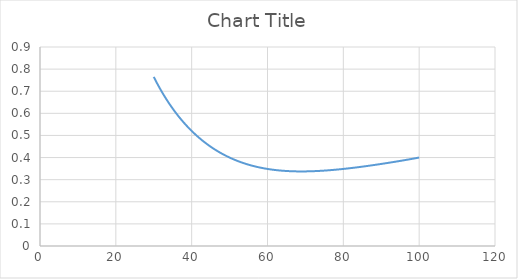
| Category | Series 0 |
|---|---|
| 30.0 | 0.765 |
| 31.0 | 0.732 |
| 32.0 | 0.701 |
| 33.0 | 0.673 |
| 34.0 | 0.646 |
| 35.0 | 0.621 |
| 36.0 | 0.598 |
| 37.0 | 0.577 |
| 38.0 | 0.557 |
| 39.0 | 0.538 |
| 40.0 | 0.52 |
| 41.0 | 0.504 |
| 42.0 | 0.489 |
| 43.0 | 0.475 |
| 44.0 | 0.461 |
| 45.0 | 0.449 |
| 46.0 | 0.438 |
| 47.0 | 0.427 |
| 48.0 | 0.417 |
| 49.0 | 0.408 |
| 50.0 | 0.4 |
| 51.0 | 0.392 |
| 52.0 | 0.385 |
| 53.0 | 0.379 |
| 54.0 | 0.373 |
| 55.0 | 0.368 |
| 56.0 | 0.363 |
| 57.0 | 0.359 |
| 58.0 | 0.355 |
| 59.0 | 0.351 |
| 60.0 | 0.348 |
| 61.0 | 0.346 |
| 62.0 | 0.344 |
| 63.0 | 0.342 |
| 64.0 | 0.34 |
| 65.0 | 0.339 |
| 66.0 | 0.338 |
| 67.0 | 0.338 |
| 68.0 | 0.337 |
| 69.0 | 0.337 |
| 70.0 | 0.337 |
| 71.0 | 0.338 |
| 72.0 | 0.338 |
| 73.0 | 0.339 |
| 74.0 | 0.34 |
| 75.0 | 0.341 |
| 76.0 | 0.342 |
| 77.0 | 0.344 |
| 78.0 | 0.345 |
| 79.0 | 0.347 |
| 80.0 | 0.349 |
| 81.0 | 0.35 |
| 82.0 | 0.352 |
| 83.0 | 0.354 |
| 84.0 | 0.357 |
| 85.0 | 0.359 |
| 86.0 | 0.361 |
| 87.0 | 0.364 |
| 88.0 | 0.366 |
| 89.0 | 0.369 |
| 90.0 | 0.371 |
| 91.0 | 0.374 |
| 92.0 | 0.376 |
| 93.0 | 0.379 |
| 94.0 | 0.382 |
| 95.0 | 0.385 |
| 96.0 | 0.388 |
| 97.0 | 0.391 |
| 98.0 | 0.394 |
| 99.0 | 0.397 |
| 100.0 | 0.4 |